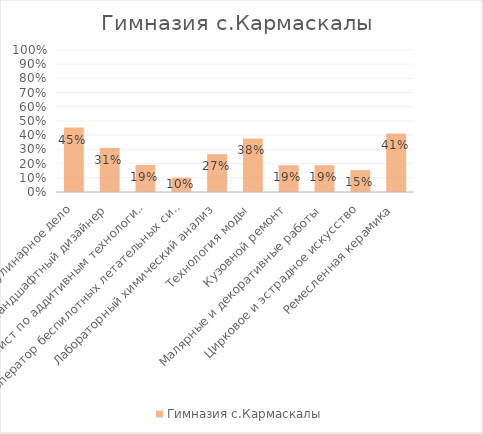
| Category | Гимназия с.Кармаскалы |
|---|---|
| Кулинарное дело | 0.454 |
| Ландшафтный дизайнер | 0.31 |
| Специалист по аддитивным технологиям | 0.19 |
| Оператор беспилотных летательных систем | 0.101 |
| Лабораторный химический анализ | 0.267 |
| Технология моды | 0.377 |
| Кузовной ремонт | 0.189 |
| Малярные и декоративные работы | 0.189 |
| Цирковое и эстрадное искусство | 0.154 |
| Ремесленная керамика | 0.412 |